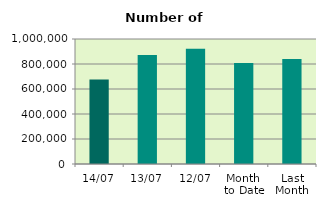
| Category | Series 0 |
|---|---|
| 14/07 | 675520 |
| 13/07 | 871302 |
| 12/07 | 922126 |
| Month 
to Date | 808860.8 |
| Last
Month | 840506.364 |